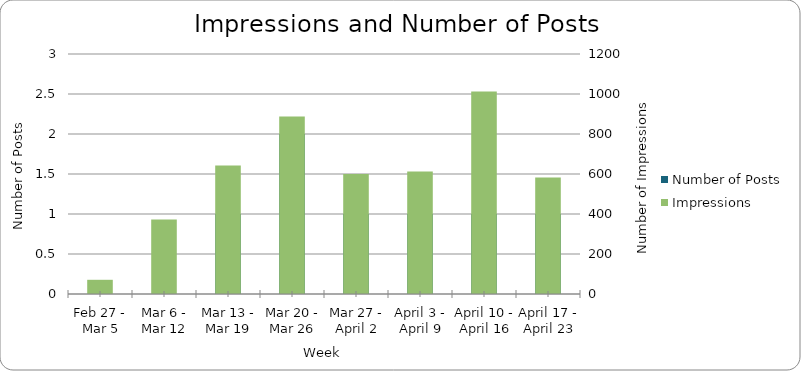
| Category | Number of Posts |
|---|---|
| Feb 27 - Mar 5 | 0 |
| Mar 6 - Mar 12 | 0 |
| Mar 13 - Mar 19 | 1 |
| Mar 20 - Mar 26 | 2 |
| Mar 27 - April 2 | 1 |
| April 3 - April 9 | 1 |
| April 10 - April 16 | 1 |
| April 17 - April 23 | 1 |